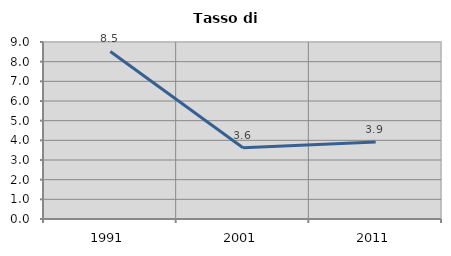
| Category | Tasso di disoccupazione   |
|---|---|
| 1991.0 | 8.518 |
| 2001.0 | 3.62 |
| 2011.0 | 3.917 |